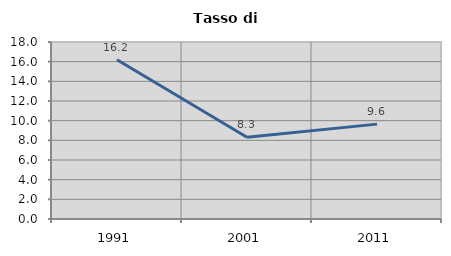
| Category | Tasso di disoccupazione   |
|---|---|
| 1991.0 | 16.2 |
| 2001.0 | 8.312 |
| 2011.0 | 9.648 |